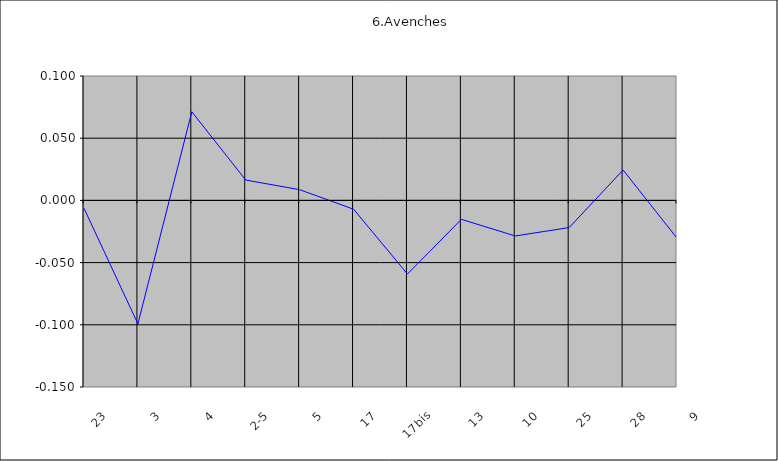
| Category | Avenches |
|---|---|
| 23 | -0.006 |
| 3 | -0.099 |
| 4 | 0.071 |
| 2-5 | 0.016 |
| 5 | 0.009 |
| 17 | -0.007 |
| 17bis | -0.059 |
| 13 | -0.015 |
| 10 | -0.029 |
| 25 | -0.022 |
| 28 | 0.024 |
| 9 | -0.03 |